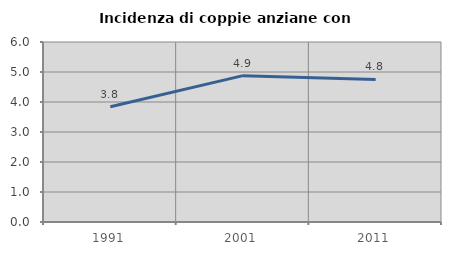
| Category | Incidenza di coppie anziane con figli |
|---|---|
| 1991.0 | 3.843 |
| 2001.0 | 4.878 |
| 2011.0 | 4.752 |